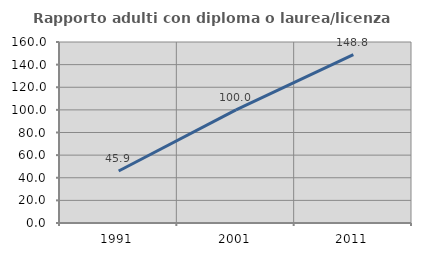
| Category | Rapporto adulti con diploma o laurea/licenza media  |
|---|---|
| 1991.0 | 45.946 |
| 2001.0 | 100 |
| 2011.0 | 148.81 |